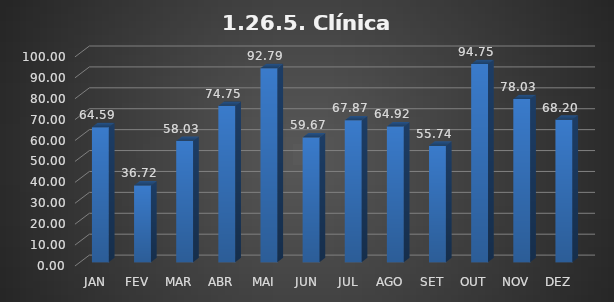
| Category | 1.26.5. Clínica Ortopédica |
|---|---|
|  JAN  | 64.59 |
|  FEV  | 36.721 |
|  MAR  | 58.033 |
|  ABR  | 74.754 |
|  MAI  | 92.787 |
|  JUN  | 59.672 |
|  JUL  | 67.869 |
|  AGO  | 64.918 |
|  SET  | 55.738 |
|  OUT  | 94.754 |
|  NOV  | 78.033 |
|  DEZ  | 68.197 |